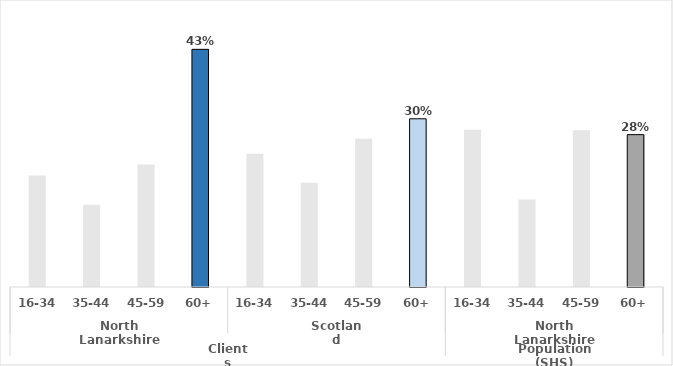
| Category | Series 0 |
|---|---|
| 0 | 0.201 |
| 1 | 0.148 |
| 2 | 0.221 |
| 3 | 0.429 |
| 4 | 0.24 |
| 5 | 0.188 |
| 6 | 0.268 |
| 7 | 0.304 |
| 8 | 0.284 |
| 9 | 0.158 |
| 10 | 0.283 |
| 11 | 0.275 |